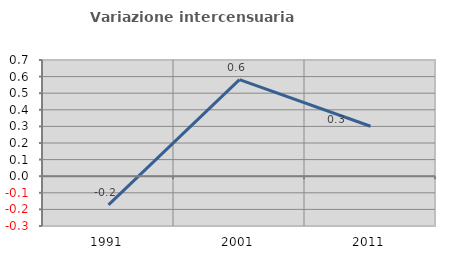
| Category | Variazione intercensuaria annua |
|---|---|
| 1991.0 | -0.172 |
| 2001.0 | 0.582 |
| 2011.0 | 0.301 |